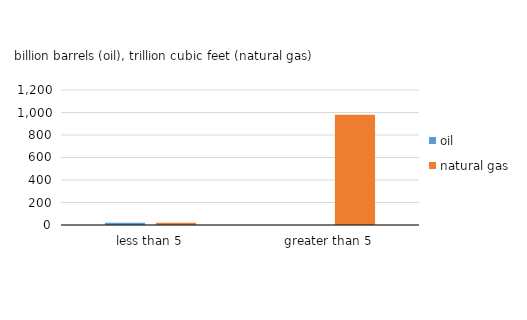
| Category | oil | natural gas |
|---|---|---|
| less than 5 | 21.1 | 19.8 |
| greater than 5 | 0.4 | 979.2 |